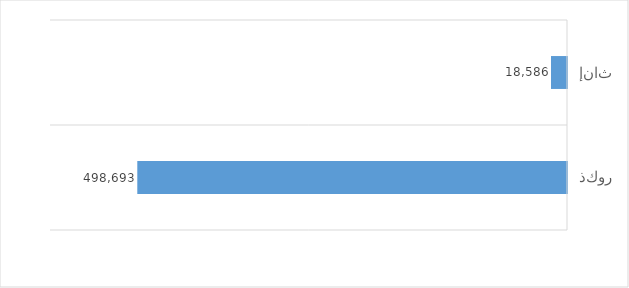
| Category | Series 0 |
|---|---|
| ذكور
 | 498693 |
| إناث
 | 18586 |